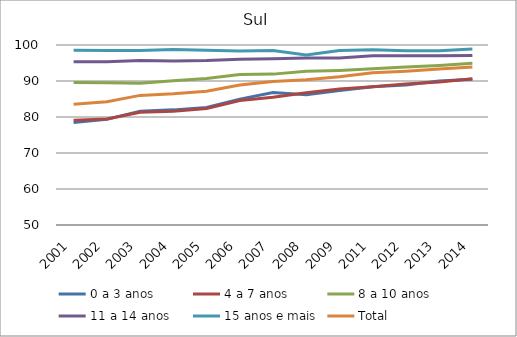
| Category | 0 a 3 anos | 4 a 7 anos | 8 a 10 anos | 11 a 14 anos | 15 anos e mais | Total |
|---|---|---|---|---|---|---|
| 2001.0 | 78.47 | 79.11 | 89.57 | 95.32 | 98.54 | 83.57 |
| 2002.0 | 79.34 | 79.47 | 89.51 | 95.37 | 98.49 | 84.26 |
| 2003.0 | 81.63 | 81.31 | 89.37 | 95.71 | 98.47 | 86 |
| 2004.0 | 81.98 | 81.57 | 90.09 | 95.57 | 98.75 | 86.46 |
| 2005.0 | 82.66 | 82.37 | 90.68 | 95.67 | 98.52 | 87.16 |
| 2006.0 | 84.97 | 84.59 | 91.79 | 96.06 | 98.31 | 88.91 |
| 2007.0 | 86.8 | 85.5 | 91.91 | 96.17 | 98.44 | 89.88 |
| 2008.0 | 86.2 | 86.74 | 92.68 | 96.39 | 97.21 | 90.35 |
| 2009.0 | 87.34 | 87.75 | 92.94 | 96.42 | 98.46 | 91.18 |
| 2011.0 | 88.4 | 88.4 | 93.4 | 97 | 98.7 | 92.3 |
| 2012.0 | 88.9 | 89.2 | 93.9 | 97 | 98.4 | 92.7 |
| 2013.0 | 90 | 89.7 | 94.3 | 97 | 98.4 | 93.3 |
| 2014.0 | 90.5 | 90.6 | 94.9 | 97.1 | 98.9 | 93.9 |